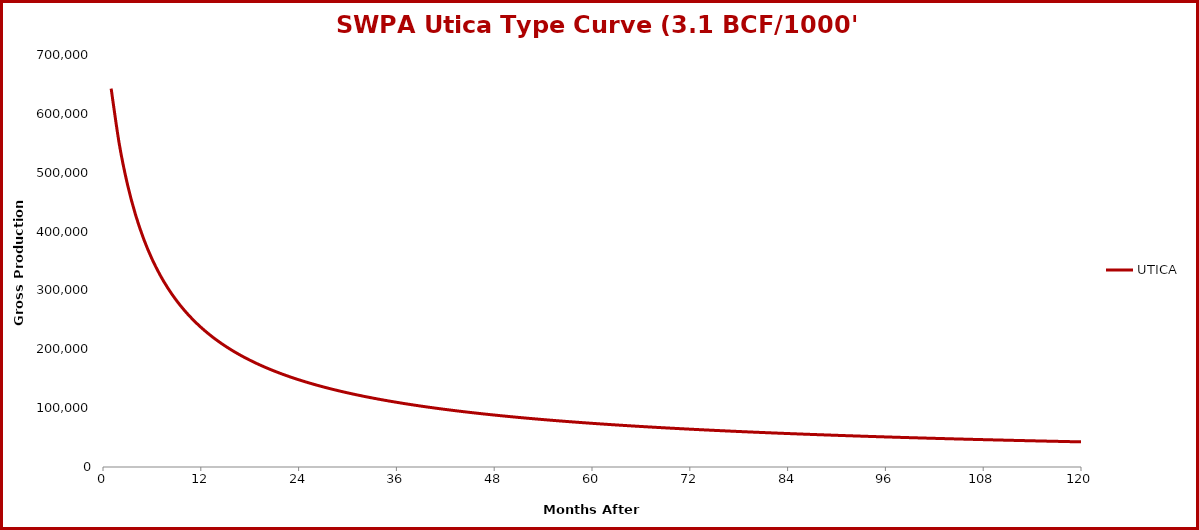
| Category | UTICA |
|---|---|
| 1.0 | 642891 |
| 2.0 | 548576 |
| 3.0 | 480201 |
| 4.0 | 428162 |
| 5.0 | 387116 |
| 6.0 | 353842 |
| 7.0 | 326277 |
| 8.0 | 303035 |
| 9.0 | 283150 |
| 10.0 | 265928 |
| 11.0 | 250855 |
| 12.0 | 237542 |
| 13.0 | 225691 |
| 14.0 | 215068 |
| 15.0 | 205486 |
| 16.0 | 196796 |
| 17.0 | 188876 |
| 18.0 | 181624 |
| 19.0 | 174959 |
| 20.0 | 168809 |
| 21.0 | 163115 |
| 22.0 | 157827 |
| 23.0 | 152903 |
| 24.0 | 148304 |
| 25.0 | 143999 |
| 26.0 | 139960 |
| 27.0 | 136162 |
| 28.0 | 132583 |
| 29.0 | 129206 |
| 30.0 | 126011 |
| 31.0 | 122986 |
| 32.0 | 120116 |
| 33.0 | 117389 |
| 34.0 | 114795 |
| 35.0 | 112324 |
| 36.0 | 109967 |
| 37.0 | 107716 |
| 38.0 | 105564 |
| 39.0 | 103504 |
| 40.0 | 101531 |
| 41.0 | 99638 |
| 42.0 | 97822 |
| 43.0 | 96077 |
| 44.0 | 94398 |
| 45.0 | 92783 |
| 46.0 | 91228 |
| 47.0 | 89729 |
| 48.0 | 88283 |
| 49.0 | 86887 |
| 50.0 | 85539 |
| 51.0 | 84236 |
| 52.0 | 82976 |
| 53.0 | 81757 |
| 54.0 | 80576 |
| 55.0 | 79433 |
| 56.0 | 78324 |
| 57.0 | 77249 |
| 58.0 | 76206 |
| 59.0 | 75193 |
| 60.0 | 74210 |
| 61.0 | 73254 |
| 62.0 | 72325 |
| 63.0 | 71422 |
| 64.0 | 70543 |
| 65.0 | 69687 |
| 66.0 | 68854 |
| 67.0 | 68043 |
| 68.0 | 67252 |
| 69.0 | 66481 |
| 70.0 | 65730 |
| 71.0 | 64996 |
| 72.0 | 64281 |
| 73.0 | 63583 |
| 74.0 | 62901 |
| 75.0 | 62235 |
| 76.0 | 61584 |
| 77.0 | 60949 |
| 78.0 | 60327 |
| 79.0 | 59719 |
| 80.0 | 59125 |
| 81.0 | 58543 |
| 82.0 | 57974 |
| 83.0 | 57417 |
| 84.0 | 56871 |
| 85.0 | 56337 |
| 86.0 | 55814 |
| 87.0 | 55301 |
| 88.0 | 54798 |
| 89.0 | 54306 |
| 90.0 | 53823 |
| 91.0 | 53349 |
| 92.0 | 52885 |
| 93.0 | 52429 |
| 94.0 | 51982 |
| 95.0 | 51543 |
| 96.0 | 51113 |
| 97.0 | 50690 |
| 98.0 | 50274 |
| 99.0 | 49866 |
| 100.0 | 49466 |
| 101.0 | 49072 |
| 102.0 | 48685 |
| 103.0 | 48305 |
| 104.0 | 47931 |
| 105.0 | 47564 |
| 106.0 | 47203 |
| 107.0 | 46847 |
| 108.0 | 46498 |
| 109.0 | 46154 |
| 110.0 | 45816 |
| 111.0 | 45483 |
| 112.0 | 45155 |
| 113.0 | 44833 |
| 114.0 | 44516 |
| 115.0 | 44203 |
| 116.0 | 43895 |
| 117.0 | 43592 |
| 118.0 | 43294 |
| 119.0 | 43000 |
| 120.0 | 42710 |
| 121.0 | 42425 |
| 122.0 | 42144 |
| 123.0 | 41867 |
| 124.0 | 41593 |
| 125.0 | 41324 |
| 126.0 | 41059 |
| 127.0 | 40797 |
| 128.0 | 40539 |
| 129.0 | 40284 |
| 130.0 | 40033 |
| 131.0 | 39785 |
| 132.0 | 39541 |
| 133.0 | 39300 |
| 134.0 | 39062 |
| 135.0 | 38828 |
| 136.0 | 38596 |
| 137.0 | 38368 |
| 138.0 | 38142 |
| 139.0 | 37919 |
| 140.0 | 37699 |
| 141.0 | 37482 |
| 142.0 | 37268 |
| 143.0 | 37056 |
| 144.0 | 36847 |
| 145.0 | 36641 |
| 146.0 | 36437 |
| 147.0 | 36235 |
| 148.0 | 36036 |
| 149.0 | 35840 |
| 150.0 | 35645 |
| 151.0 | 35453 |
| 152.0 | 35263 |
| 153.0 | 35076 |
| 154.0 | 34891 |
| 155.0 | 34707 |
| 156.0 | 34526 |
| 157.0 | 34347 |
| 158.0 | 34170 |
| 159.0 | 33995 |
| 160.0 | 33820 |
| 161.0 | 33646 |
| 162.0 | 33473 |
| 163.0 | 33301 |
| 164.0 | 33129 |
| 165.0 | 32959 |
| 166.0 | 32789 |
| 167.0 | 32621 |
| 168.0 | 32453 |
| 169.0 | 32286 |
| 170.0 | 32120 |
| 171.0 | 31955 |
| 172.0 | 31791 |
| 173.0 | 31627 |
| 174.0 | 31464 |
| 175.0 | 31303 |
| 176.0 | 31142 |
| 177.0 | 30981 |
| 178.0 | 30822 |
| 179.0 | 30664 |
| 180.0 | 30506 |
| 181.0 | 30349 |
| 182.0 | 30193 |
| 183.0 | 30038 |
| 184.0 | 29883 |
| 185.0 | 29729 |
| 186.0 | 29577 |
| 187.0 | 29424 |
| 188.0 | 29273 |
| 189.0 | 29123 |
| 190.0 | 28973 |
| 191.0 | 28824 |
| 192.0 | 28676 |
| 193.0 | 28528 |
| 194.0 | 28381 |
| 195.0 | 28235 |
| 196.0 | 28090 |
| 197.0 | 27946 |
| 198.0 | 27802 |
| 199.0 | 27659 |
| 200.0 | 27517 |
| 201.0 | 27375 |
| 202.0 | 27234 |
| 203.0 | 27094 |
| 204.0 | 26955 |
| 205.0 | 26816 |
| 206.0 | 26678 |
| 207.0 | 26541 |
| 208.0 | 26405 |
| 209.0 | 26269 |
| 210.0 | 26134 |
| 211.0 | 25999 |
| 212.0 | 25866 |
| 213.0 | 25733 |
| 214.0 | 25600 |
| 215.0 | 25469 |
| 216.0 | 25338 |
| 217.0 | 25207 |
| 218.0 | 25078 |
| 219.0 | 24949 |
| 220.0 | 24820 |
| 221.0 | 24693 |
| 222.0 | 24566 |
| 223.0 | 24439 |
| 224.0 | 24314 |
| 225.0 | 24189 |
| 226.0 | 24064 |
| 227.0 | 23941 |
| 228.0 | 23817 |
| 229.0 | 23695 |
| 230.0 | 23573 |
| 231.0 | 23452 |
| 232.0 | 23331 |
| 233.0 | 23211 |
| 234.0 | 23092 |
| 235.0 | 22973 |
| 236.0 | 22855 |
| 237.0 | 22737 |
| 238.0 | 22620 |
| 239.0 | 22504 |
| 240.0 | 22388 |
| 241.0 | 22273 |
| 242.0 | 22159 |
| 243.0 | 22045 |
| 244.0 | 21931 |
| 245.0 | 21819 |
| 246.0 | 21706 |
| 247.0 | 21595 |
| 248.0 | 21484 |
| 249.0 | 21373 |
| 250.0 | 21263 |
| 251.0 | 21154 |
| 252.0 | 21045 |
| 253.0 | 20937 |
| 254.0 | 20829 |
| 255.0 | 20722 |
| 256.0 | 20615 |
| 257.0 | 20509 |
| 258.0 | 20404 |
| 259.0 | 20299 |
| 260.0 | 20195 |
| 261.0 | 20091 |
| 262.0 | 19987 |
| 263.0 | 19885 |
| 264.0 | 19782 |
| 265.0 | 19681 |
| 266.0 | 19579 |
| 267.0 | 19479 |
| 268.0 | 19379 |
| 269.0 | 19279 |
| 270.0 | 19180 |
| 271.0 | 19081 |
| 272.0 | 18983 |
| 273.0 | 18885 |
| 274.0 | 18788 |
| 275.0 | 18692 |
| 276.0 | 18595 |
| 277.0 | 18500 |
| 278.0 | 18405 |
| 279.0 | 18310 |
| 280.0 | 18216 |
| 281.0 | 18122 |
| 282.0 | 18029 |
| 283.0 | 17936 |
| 284.0 | 17844 |
| 285.0 | 17752 |
| 286.0 | 17661 |
| 287.0 | 17570 |
| 288.0 | 17480 |
| 289.0 | 17390 |
| 290.0 | 17300 |
| 291.0 | 17211 |
| 292.0 | 17123 |
| 293.0 | 17035 |
| 294.0 | 16947 |
| 295.0 | 16860 |
| 296.0 | 16773 |
| 297.0 | 16687 |
| 298.0 | 16601 |
| 299.0 | 16516 |
| 300.0 | 16431 |
| 301.0 | 16346 |
| 302.0 | 16262 |
| 303.0 | 16179 |
| 304.0 | 16096 |
| 305.0 | 16013 |
| 306.0 | 15930 |
| 307.0 | 15848 |
| 308.0 | 15767 |
| 309.0 | 15686 |
| 310.0 | 15605 |
| 311.0 | 15525 |
| 312.0 | 15445 |
| 313.0 | 15366 |
| 314.0 | 15287 |
| 315.0 | 15208 |
| 316.0 | 15130 |
| 317.0 | 15052 |
| 318.0 | 14975 |
| 319.0 | 14898 |
| 320.0 | 14821 |
| 321.0 | 14745 |
| 322.0 | 14669 |
| 323.0 | 14593 |
| 324.0 | 14518 |
| 325.0 | 14444 |
| 326.0 | 14369 |
| 327.0 | 14296 |
| 328.0 | 14222 |
| 329.0 | 14149 |
| 330.0 | 14076 |
| 331.0 | 14004 |
| 332.0 | 13932 |
| 333.0 | 13860 |
| 334.0 | 13789 |
| 335.0 | 13718 |
| 336.0 | 13647 |
| 337.0 | 13577 |
| 338.0 | 13507 |
| 339.0 | 13438 |
| 340.0 | 13369 |
| 341.0 | 13300 |
| 342.0 | 13232 |
| 343.0 | 13163 |
| 344.0 | 13096 |
| 345.0 | 13028 |
| 346.0 | 12961 |
| 347.0 | 12895 |
| 348.0 | 12828 |
| 349.0 | 12762 |
| 350.0 | 12697 |
| 351.0 | 12632 |
| 352.0 | 12567 |
| 353.0 | 12502 |
| 354.0 | 12438 |
| 355.0 | 12374 |
| 356.0 | 12310 |
| 357.0 | 12247 |
| 358.0 | 12184 |
| 359.0 | 12121 |
| 360.0 | 12059 |
| 361.0 | 11997 |
| 362.0 | 11935 |
| 363.0 | 11874 |
| 364.0 | 11813 |
| 365.0 | 11752 |
| 366.0 | 11691 |
| 367.0 | 11631 |
| 368.0 | 11571 |
| 369.0 | 11512 |
| 370.0 | 11453 |
| 371.0 | 11394 |
| 372.0 | 11335 |
| 373.0 | 11277 |
| 374.0 | 11219 |
| 375.0 | 11161 |
| 376.0 | 11104 |
| 377.0 | 11047 |
| 378.0 | 10990 |
| 379.0 | 10933 |
| 380.0 | 10877 |
| 381.0 | 10821 |
| 382.0 | 10766 |
| 383.0 | 10710 |
| 384.0 | 10655 |
| 385.0 | 10600 |
| 386.0 | 10546 |
| 387.0 | 10492 |
| 388.0 | 10438 |
| 389.0 | 10384 |
| 390.0 | 10330 |
| 391.0 | 10277 |
| 392.0 | 10225 |
| 393.0 | 10172 |
| 394.0 | 10120 |
| 395.0 | 10068 |
| 396.0 | 10016 |
| 397.0 | 9964 |
| 398.0 | 9913 |
| 399.0 | 9862 |
| 400.0 | 9811 |
| 401.0 | 9761 |
| 402.0 | 9711 |
| 403.0 | 9661 |
| 404.0 | 9611 |
| 405.0 | 9562 |
| 406.0 | 9512 |
| 407.0 | 9464 |
| 408.0 | 9415 |
| 409.0 | 9366 |
| 410.0 | 9318 |
| 411.0 | 9270 |
| 412.0 | 9223 |
| 413.0 | 9175 |
| 414.0 | 9128 |
| 415.0 | 9081 |
| 416.0 | 9034 |
| 417.0 | 8988 |
| 418.0 | 8942 |
| 419.0 | 8896 |
| 420.0 | 8850 |
| 421.0 | 8804 |
| 422.0 | 8759 |
| 423.0 | 8714 |
| 424.0 | 8669 |
| 425.0 | 8625 |
| 426.0 | 8580 |
| 427.0 | 8536 |
| 428.0 | 8492 |
| 429.0 | 8449 |
| 430.0 | 8405 |
| 431.0 | 8362 |
| 432.0 | 8319 |
| 433.0 | 8276 |
| 434.0 | 8234 |
| 435.0 | 8191 |
| 436.0 | 8149 |
| 437.0 | 8107 |
| 438.0 | 8066 |
| 439.0 | 8024 |
| 440.0 | 7983 |
| 441.0 | 7942 |
| 442.0 | 7901 |
| 443.0 | 7860 |
| 444.0 | 7820 |
| 445.0 | 7780 |
| 446.0 | 7740 |
| 447.0 | 7700 |
| 448.0 | 7660 |
| 449.0 | 7621 |
| 450.0 | 7582 |
| 451.0 | 7543 |
| 452.0 | 7504 |
| 453.0 | 7465 |
| 454.0 | 7427 |
| 455.0 | 7389 |
| 456.0 | 7351 |
| 457.0 | 7313 |
| 458.0 | 7275 |
| 459.0 | 7238 |
| 460.0 | 7201 |
| 461.0 | 7164 |
| 462.0 | 7127 |
| 463.0 | 7090 |
| 464.0 | 7054 |
| 465.0 | 7017 |
| 466.0 | 6981 |
| 467.0 | 6945 |
| 468.0 | 6910 |
| 469.0 | 6874 |
| 470.0 | 6839 |
| 471.0 | 6804 |
| 472.0 | 6769 |
| 473.0 | 6734 |
| 474.0 | 6699 |
| 475.0 | 6665 |
| 476.0 | 6630 |
| 477.0 | 6596 |
| 478.0 | 6562 |
| 479.0 | 6529 |
| 480.0 | 6495 |
| 481.0 | 6462 |
| 482.0 | 6428 |
| 483.0 | 6395 |
| 484.0 | 6362 |
| 485.0 | 6330 |
| 486.0 | 6297 |
| 487.0 | 6265 |
| 488.0 | 6233 |
| 489.0 | 6200 |
| 490.0 | 6169 |
| 491.0 | 6137 |
| 492.0 | 6105 |
| 493.0 | 6074 |
| 494.0 | 6043 |
| 495.0 | 6012 |
| 496.0 | 5981 |
| 497.0 | 5950 |
| 498.0 | 5919 |
| 499.0 | 5889 |
| 500.0 | 5859 |
| 501.0 | 5828 |
| 502.0 | 5798 |
| 503.0 | 5769 |
| 504.0 | 5739 |
| 505.0 | 5709 |
| 506.0 | 5680 |
| 507.0 | 5651 |
| 508.0 | 5622 |
| 509.0 | 5593 |
| 510.0 | 5564 |
| 511.0 | 5536 |
| 512.0 | 5507 |
| 513.0 | 5479 |
| 514.0 | 5451 |
| 515.0 | 5423 |
| 516.0 | 5395 |
| 517.0 | 5367 |
| 518.0 | 5339 |
| 519.0 | 5312 |
| 520.0 | 5285 |
| 521.0 | 5257 |
| 522.0 | 5230 |
| 523.0 | 5203 |
| 524.0 | 5177 |
| 525.0 | 5150 |
| 526.0 | 5124 |
| 527.0 | 5097 |
| 528.0 | 5071 |
| 529.0 | 5045 |
| 530.0 | 5019 |
| 531.0 | 4993 |
| 532.0 | 4967 |
| 533.0 | 4942 |
| 534.0 | 4916 |
| 535.0 | 4891 |
| 536.0 | 4866 |
| 537.0 | 4841 |
| 538.0 | 4816 |
| 539.0 | 4791 |
| 540.0 | 4767 |
| 541.0 | 4742 |
| 542.0 | 4718 |
| 543.0 | 4694 |
| 544.0 | 4669 |
| 545.0 | 4645 |
| 546.0 | 4622 |
| 547.0 | 4598 |
| 548.0 | 4574 |
| 549.0 | 4551 |
| 550.0 | 4527 |
| 551.0 | 4504 |
| 552.0 | 4481 |
| 553.0 | 4458 |
| 554.0 | 4435 |
| 555.0 | 4412 |
| 556.0 | 4389 |
| 557.0 | 4367 |
| 558.0 | 4344 |
| 559.0 | 4322 |
| 560.0 | 4300 |
| 561.0 | 4278 |
| 562.0 | 4256 |
| 563.0 | 4234 |
| 564.0 | 4212 |
| 565.0 | 4190 |
| 566.0 | 4169 |
| 567.0 | 4147 |
| 568.0 | 4126 |
| 569.0 | 4105 |
| 570.0 | 4084 |
| 571.0 | 4063 |
| 572.0 | 4042 |
| 573.0 | 4021 |
| 574.0 | 4000 |
| 575.0 | 3980 |
| 576.0 | 3959 |
| 577.0 | 3939 |
| 578.0 | 3919 |
| 579.0 | 3898 |
| 580.0 | 3878 |
| 581.0 | 3858 |
| 582.0 | 3839 |
| 583.0 | 3819 |
| 584.0 | 3799 |
| 585.0 | 3780 |
| 586.0 | 3760 |
| 587.0 | 3741 |
| 588.0 | 3722 |
| 589.0 | 3702 |
| 590.0 | 3683 |
| 591.0 | 3664 |
| 592.0 | 3646 |
| 593.0 | 3627 |
| 594.0 | 3608 |
| 595.0 | 3590 |
| 596.0 | 3571 |
| 597.0 | 3553 |
| 598.0 | 3535 |
| 599.0 | 3516 |
| 600.0 | 3498 |
| 601.0 | 3480 |
| 602.0 | 3462 |
| 603.0 | 3445 |
| 604.0 | 3427 |
| 605.0 | 3409 |
| 606.0 | 3392 |
| 607.0 | 3374 |
| 608.0 | 3357 |
| 609.0 | 3340 |
| 610.0 | 3323 |
| 611.0 | 3305 |
| 612.0 | 3288 |
| 613.0 | 3272 |
| 614.0 | 3255 |
| 615.0 | 3238 |
| 616.0 | 3221 |
| 617.0 | 3205 |
| 618.0 | 3188 |
| 619.0 | 3172 |
| 620.0 | 3156 |
| 621.0 | 3139 |
| 622.0 | 3123 |
| 623.0 | 3107 |
| 624.0 | 3091 |
| 625.0 | 3075 |
| 626.0 | 3059 |
| 627.0 | 3044 |
| 628.0 | 3028 |
| 629.0 | 3012 |
| 630.0 | 2997 |
| 631.0 | 2982 |
| 632.0 | 2966 |
| 633.0 | 2951 |
| 634.0 | 2936 |
| 635.0 | 2921 |
| 636.0 | 2906 |
| 637.0 | 2891 |
| 638.0 | 2876 |
| 639.0 | 2861 |
| 640.0 | 2846 |
| 641.0 | 2832 |
| 642.0 | 2817 |
| 643.0 | 2803 |
| 644.0 | 2788 |
| 645.0 | 2774 |
| 646.0 | 2760 |
| 647.0 | 2745 |
| 648.0 | 2731 |
| 649.0 | 2717 |
| 650.0 | 2703 |
| 651.0 | 2689 |
| 652.0 | 2676 |
| 653.0 | 2662 |
| 654.0 | 2648 |
| 655.0 | 2634 |
| 656.0 | 2621 |
| 657.0 | 2607 |
| 658.0 | 2594 |
| 659.0 | 2581 |
| 660.0 | 2567 |
| 661.0 | 2554 |
| 662.0 | 2541 |
| 663.0 | 2528 |
| 664.0 | 2515 |
| 665.0 | 2502 |
| 666.0 | 2489 |
| 667.0 | 2476 |
| 668.0 | 2464 |
| 669.0 | 2451 |
| 670.0 | 2438 |
| 671.0 | 2426 |
| 672.0 | 2413 |
| 673.0 | 2401 |
| 674.0 | 2389 |
| 675.0 | 2376 |
| 676.0 | 2364 |
| 677.0 | 2352 |
| 678.0 | 2340 |
| 679.0 | 2328 |
| 680.0 | 2316 |
| 681.0 | 2304 |
| 682.0 | 2292 |
| 683.0 | 2280 |
| 684.0 | 2269 |
| 685.0 | 2257 |
| 686.0 | 2245 |
| 687.0 | 2234 |
| 688.0 | 2222 |
| 689.0 | 2211 |
| 690.0 | 2199 |
| 691.0 | 2188 |
| 692.0 | 2177 |
| 693.0 | 2166 |
| 694.0 | 2155 |
| 695.0 | 2143 |
| 696.0 | 2132 |
| 697.0 | 2121 |
| 698.0 | 2111 |
| 699.0 | 2100 |
| 700.0 | 2089 |
| 701.0 | 2078 |
| 702.0 | 2068 |
| 703.0 | 2057 |
| 704.0 | 2046 |
| 705.0 | 2036 |
| 706.0 | 2025 |
| 707.0 | 2015 |
| 708.0 | 2005 |
| 709.0 | 1994 |
| 710.0 | 1984 |
| 711.0 | 1974 |
| 712.0 | 1964 |
| 713.0 | 1953 |
| 714.0 | 1943 |
| 715.0 | 1933 |
| 716.0 | 1924 |
| 717.0 | 1914 |
| 718.0 | 1904 |
| 719.0 | 1894 |
| 720.0 | 1884 |
| 721.0 | 1875 |
| 722.0 | 1865 |
| 723.0 | 1855 |
| 724.0 | 1846 |
| 725.0 | 1836 |
| 726.0 | 1827 |
| 727.0 | 1817 |
| 728.0 | 1808 |
| 729.0 | 1799 |
| 730.0 | 1790 |
| 731.0 | 1780 |
| 732.0 | 1771 |
| 733.0 | 1762 |
| 734.0 | 1753 |
| 735.0 | 1744 |
| 736.0 | 1735 |
| 737.0 | 1726 |
| 738.0 | 1717 |
| 739.0 | 1708 |
| 740.0 | 1700 |
| 741.0 | 1691 |
| 742.0 | 1682 |
| 743.0 | 1674 |
| 744.0 | 1665 |
| 745.0 | 1656 |
| 746.0 | 1648 |
| 747.0 | 1639 |
| 748.0 | 1631 |
| 749.0 | 1623 |
| 750.0 | 1614 |
| 751.0 | 1606 |
| 752.0 | 1598 |
| 753.0 | 1589 |
| 754.0 | 1581 |
| 755.0 | 1573 |
| 756.0 | 1565 |
| 757.0 | 1557 |
| 758.0 | 1549 |
| 759.0 | 1541 |
| 760.0 | 1533 |
| 761.0 | 1525 |
| 762.0 | 1517 |
| 763.0 | 1510 |
| 764.0 | 1502 |
| 765.0 | 1494 |
| 766.0 | 1486 |
| 767.0 | 1479 |
| 768.0 | 1471 |
| 769.0 | 1464 |
| 770.0 | 1456 |
| 771.0 | 1449 |
| 772.0 | 1441 |
| 773.0 | 1434 |
| 774.0 | 1426 |
| 775.0 | 1419 |
| 776.0 | 1412 |
| 777.0 | 1404 |
| 778.0 | 1397 |
| 779.0 | 1390 |
| 780.0 | 1383 |